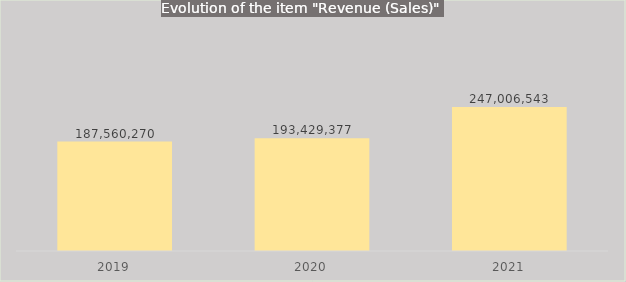
| Category | Series 0 |
|---|---|
| 2019.0 | 187560270.351 |
| 2020.0 | 193429377.019 |
| 2021.0 | 247006542.936 |